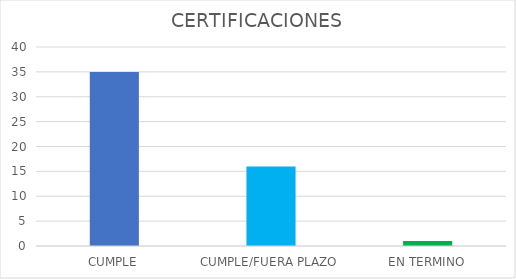
| Category | TOTAL |
|---|---|
| CUMPLE | 35 |
| CUMPLE/FUERA PLAZO | 16 |
| EN TERMINO | 1 |